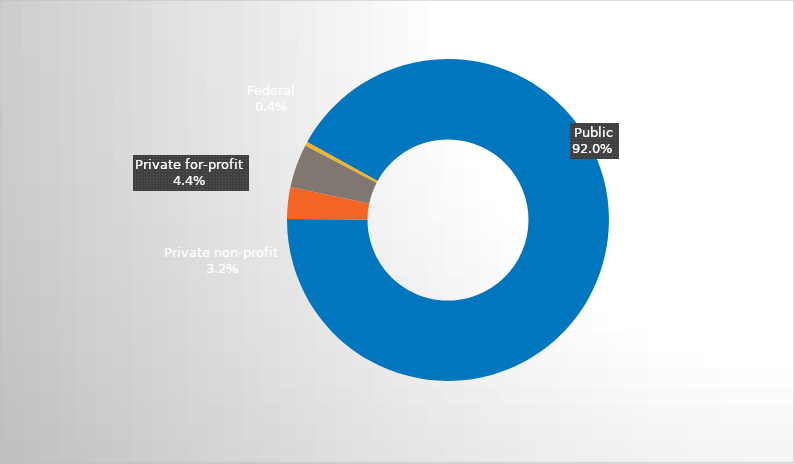
| Category | Series 0 |
|---|---|
| Public | 0.92 |
| Private non-profit | 0.032 |
| Private for-profit | 0.044 |
| Federal | 0.004 |